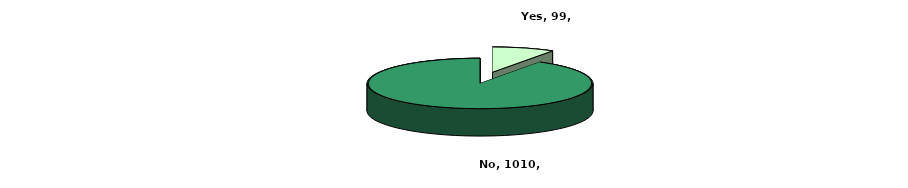
| Category | Series 0 |
|---|---|
| Yes | 99 |
| No | 1010 |